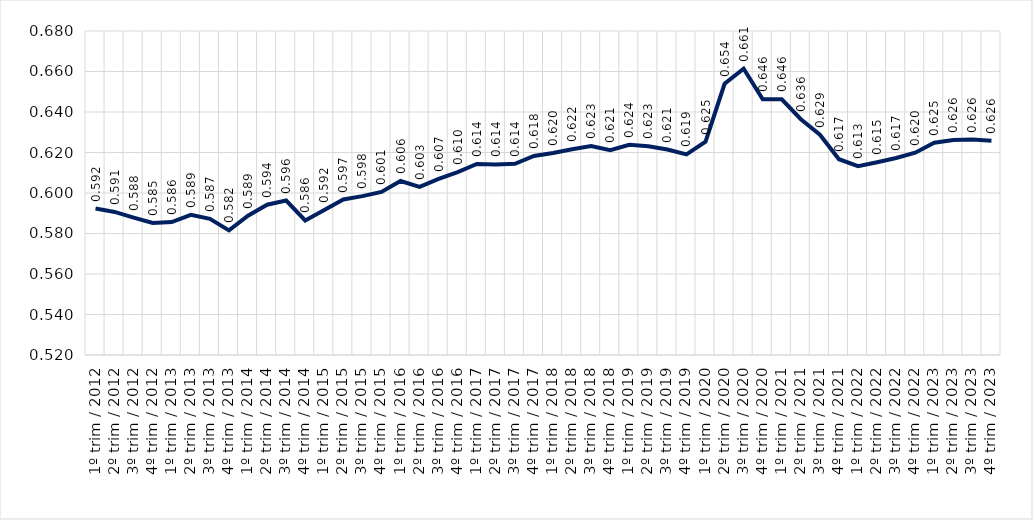
| Category | Conjunto RMs |
|---|---|
| 1º trim / 2012 | 0.592 |
| 2º trim / 2012 | 0.591 |
| 3º trim / 2012 | 0.588 |
| 4º trim / 2012 | 0.585 |
| 1º trim / 2013 | 0.586 |
| 2º trim / 2013 | 0.589 |
| 3º trim / 2013 | 0.587 |
| 4º trim / 2013 | 0.582 |
| 1º trim / 2014 | 0.589 |
| 2º trim / 2014 | 0.594 |
| 3º trim / 2014 | 0.596 |
| 4º trim / 2014 | 0.586 |
| 1º trim / 2015 | 0.592 |
| 2º trim / 2015 | 0.597 |
| 3º trim / 2015 | 0.598 |
| 4º trim / 2015 | 0.601 |
| 1º trim / 2016 | 0.606 |
| 2º trim / 2016 | 0.603 |
| 3º trim / 2016 | 0.607 |
| 4º trim / 2016 | 0.61 |
| 1º trim / 2017 | 0.614 |
| 2º trim / 2017 | 0.614 |
| 3º trim / 2017 | 0.614 |
| 4º trim / 2017 | 0.618 |
| 1º trim / 2018 | 0.62 |
| 2º trim / 2018 | 0.622 |
| 3º trim / 2018 | 0.623 |
| 4º trim / 2018 | 0.621 |
| 1º trim / 2019 | 0.624 |
| 2º trim / 2019 | 0.623 |
| 3º trim / 2019 | 0.621 |
| 4º trim / 2019 | 0.619 |
| 1º trim / 2020 | 0.625 |
| 2º trim / 2020 | 0.654 |
| 3º trim / 2020 | 0.661 |
| 4º trim / 2020 | 0.646 |
| 1º trim / 2021 | 0.646 |
| 2º trim / 2021 | 0.636 |
| 3º trim / 2021 | 0.629 |
| 4º trim / 2021 | 0.617 |
| 1º trim / 2022 | 0.613 |
| 2º trim / 2022 | 0.615 |
| 3º trim / 2022 | 0.617 |
| 4º trim / 2022 | 0.62 |
| 1º trim / 2023 | 0.625 |
| 2º trim / 2023 | 0.626 |
| 3º trim / 2023 | 0.626 |
| 4º trim / 2023 | 0.626 |